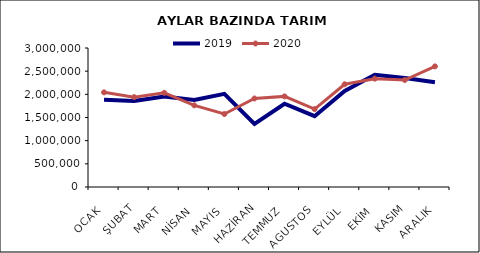
| Category | 2019 | 2020 |
|---|---|---|
| OCAK | 1881327.597 | 2043212.103 |
| ŞUBAT | 1857110.869 | 1939524.441 |
| MART | 1950395.108 | 2031888.721 |
| NİSAN | 1878347.719 | 1762710.108 |
| MAYIS | 2011076.423 | 1575782.04 |
| HAZİRAN | 1362769.9 | 1910491.181 |
| TEMMUZ | 1797330.867 | 1955676.908 |
| AGUSTOS | 1528040.209 | 1681309.693 |
| EYLÜL | 2074105.602 | 2217362.193 |
| EKİM | 2421055.437 | 2338381.777 |
| KASIM | 2353316.449 | 2309439.322 |
| ARALIK | 2258787.513 | 2603364.374 |